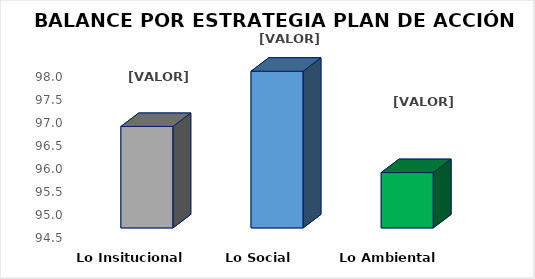
| Category | Series 0 |
|---|---|
| Lo Insitucional | 96.7 |
| Lo Social  | 97.9 |
| Lo Ambiental  | 95.7 |